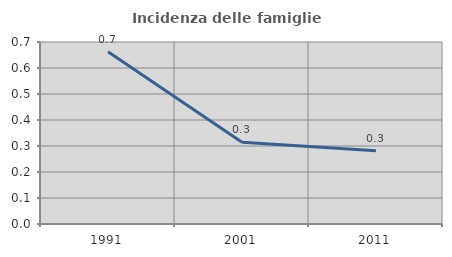
| Category | Incidenza delle famiglie numerose |
|---|---|
| 1991.0 | 0.662 |
| 2001.0 | 0.314 |
| 2011.0 | 0.282 |